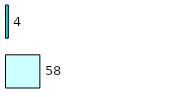
| Category | Series 0 | Series 1 |
|---|---|---|
| 0 | 58 | 4 |